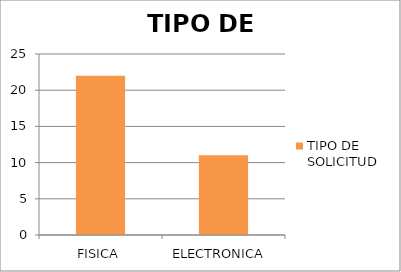
| Category | TIPO DE SOLICITUD  |
|---|---|
| FISICA | 22 |
| ELECTRONICA  | 11 |